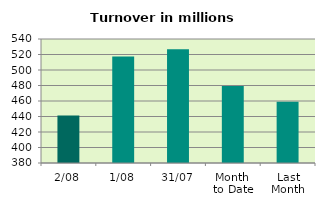
| Category | Series 0 |
|---|---|
| 2/08 | 441.262 |
| 1/08 | 517.328 |
| 31/07 | 526.851 |
| Month 
to Date | 479.295 |
| Last
Month | 459.043 |